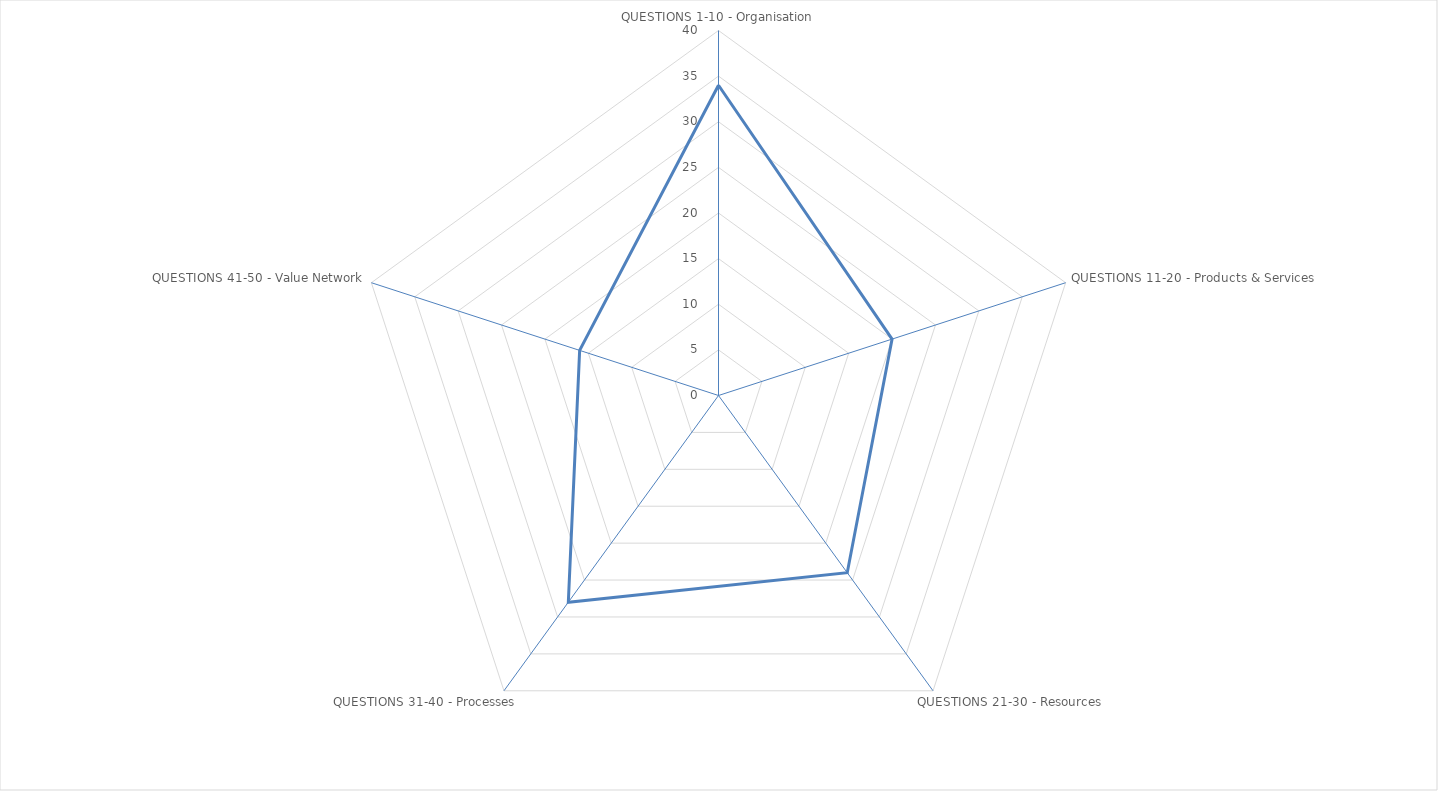
| Category | Series 0 |
|---|---|
| QUESTIONS 1-10 - Organisation | 34 |
| QUESTIONS 11-20 - Products & Services | 20 |
| QUESTIONS 21-30 - Resources | 24 |
| QUESTIONS 31-40 - Processes | 28 |
| QUESTIONS 41-50 - Value Network | 16 |